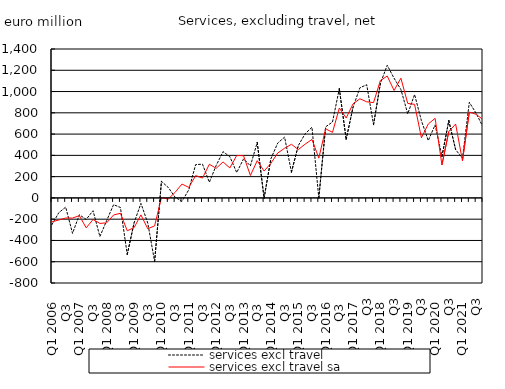
| Category | services excl travel | services excl travel sa |
|---|---|---|
| Q1 2006 | -250.583 | -225.14 |
| Q2  | -138.491 | -207.279 |
| Q3  | -86.433 | -189.164 |
| Q4  | -333.704 | -189.272 |
| Q1 2007 | -158.445 | -167.424 |
| Q2  | -201.999 | -281.511 |
| Q3  | -120.345 | -202.805 |
| Q4  | -363.672 | -239.901 |
| Q1 2008 | -211.494 | -233.874 |
| Q2  | -63.771 | -160.805 |
| Q3  | -89.824 | -144.509 |
| Q4  | -531.251 | -309.11 |
| Q1 2009 | -234.43 | -279.233 |
| Q2  | -51.162 | -159.775 |
| Q3  | -236.322 | -290.098 |
| Q4  | -598.634 | -262.854 |
| Q1 2010 | 155.755 | 1.814 |
| Q2  | 97.733 | -9.963 |
| Q3  | 6.332 | 52.581 |
| Q4  | -32.381 | 130.213 |
| Q1 2011 | 76.991 | 98.763 |
| Q2  | 313.408 | 209.542 |
| Q3  | 316.887 | 186.479 |
| Q4  | 147.131 | 316.385 |
| Q1 2012 | 305.034 | 278.349 |
| Q2  | 434.996 | 338.076 |
| Q3  | 387.546 | 281.514 |
| Q4  | 238.308 | 398.725 |
| Q1 2013 | 367.077 | 396.713 |
| Q2  | 300.897 | 210.78 |
| Q3  | 521.069 | 350.246 |
| Q4  | -1.491 | 252.335 |
| Q1 2014 | 368.933 | 325.341 |
| Q2  | 516.283 | 422.053 |
| Q3  | 571.62 | 466.618 |
| Q4  | 242.532 | 504.11 |
| Q1 2015 | 492.169 | 454.05 |
| Q2  | 602.329 | 505.509 |
| Q3  | 664.64 | 549.667 |
| Q4 | 0.249 | 374.302 |
| Q1 2016 | 668.127 | 649.556 |
| Q2  | 713.786 | 616.361 |
| Q3  | 1026.269 | 844.95 |
| Q4 | 551.042 | 750.857 |
| Q1 2017 | 851.879 | 883.973 |
| Q2  | 1034.792 | 932.235 |
| Q3 | 1064.421 | 903.776 |
| Q4 | 688.556 | 895.783 |
| Q1 2018 | 1076.193 | 1103.568 |
| Q2  | 1247.035 | 1145.419 |
| Q3 | 1125.211 | 1010.322 |
| Q4 | 1019.465 | 1125.58 |
| Q1 2019 | 790.412 | 888.087 |
| Q2  | 972.149 | 879.892 |
| Q3 | 725.657 | 564.994 |
| Q4 | 538.993 | 695 |
| Q1 2020 | 686.758 | 748.716 |
| Q2  | 389.818 | 309.992 |
| Q3 | 725.991 | 623.904 |
| Q4 | 453.791 | 694.355 |
| Q1 2021 | 372.02 | 349.3 |
| Q2  | 899.153 | 807.182 |
| Q3 | 795.066 | 786.507 |
| Q4 | 666.599 | 735.094 |